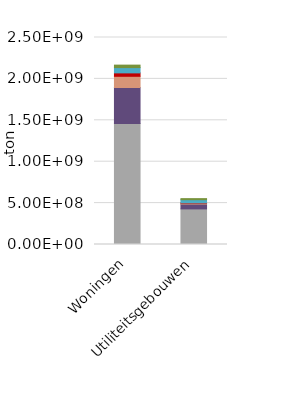
| Category | Beton | Overige constructiemineralen | Baksteen | Hout | Metalen | Overig |
|---|---|---|---|---|---|---|
| Woningen | 1462802708.063 | 433253851.115 | 135416821.177 | 41204919.689 | 63748224.48 | 29972682.272 |
| Utiliteitsgebouwen | 429875275.628 | 58384885.021 | 10708957.286 | 4352262.594 | 37692477.919 | 13041185.199 |